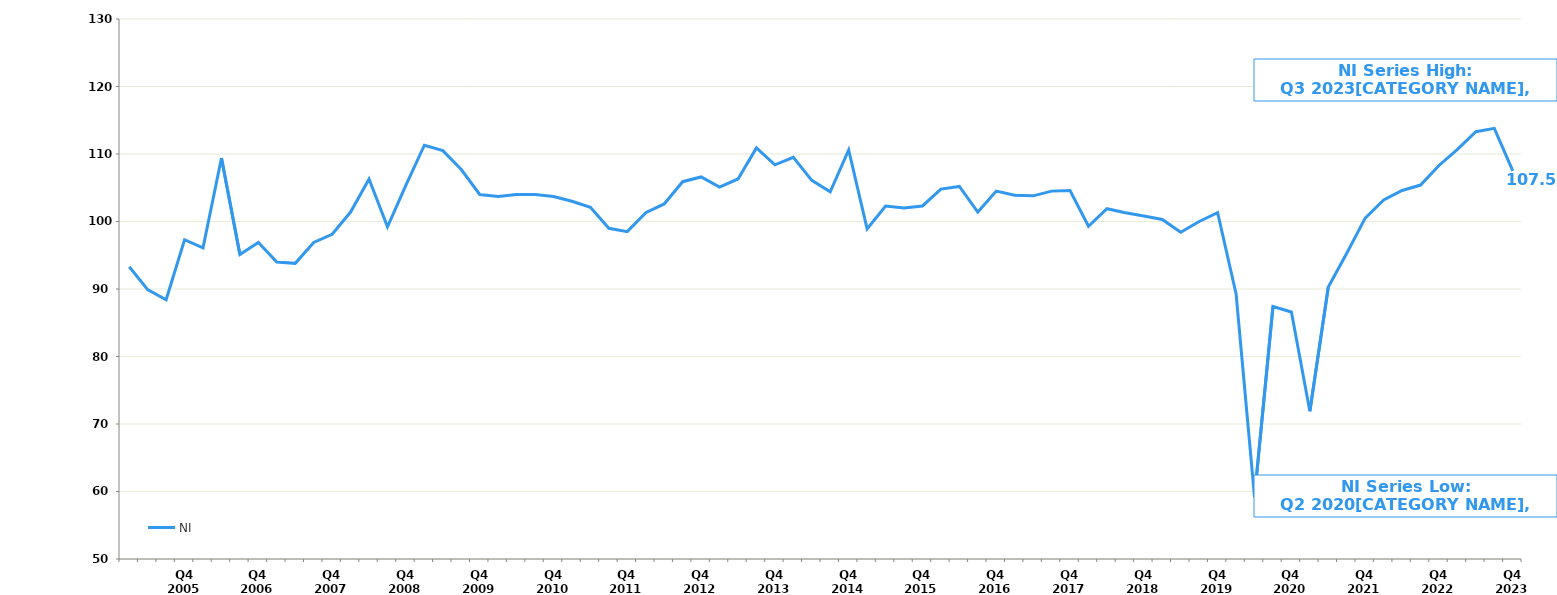
| Category | NI |
|---|---|
|  | 93.3 |
|  | 89.9 |
|  | 88.4 |
| Q4 2005 | 97.3 |
|  | 96.1 |
|  | 109.4 |
|  | 95.1 |
| Q4 2006 | 96.9 |
|  | 94 |
|  | 93.8 |
|  | 96.9 |
| Q4 2007 | 98.1 |
|  | 101.4 |
|  | 106.3 |
|  | 99.2 |
| Q4 2008 | 105.4 |
|  | 111.3 |
|  | 110.5 |
|  | 107.7 |
| Q4 2009 | 104 |
|  | 103.7 |
|  | 104 |
|  | 104 |
| Q4 2010 | 103.7 |
|  | 103 |
|  | 102.1 |
|  | 99 |
| Q4 2011 | 98.5 |
|  | 101.3 |
|  | 102.6 |
|  | 105.9 |
| Q4 2012 | 106.6 |
|  | 105.1 |
|  | 106.3 |
|  | 110.9 |
| Q4 2013 | 108.4 |
|  | 109.5 |
|  | 106.1 |
|  | 104.4 |
| Q4 2014 | 110.6 |
|  | 98.9 |
|  | 102.3 |
|  | 102 |
| Q4 2015 | 102.3 |
|  | 104.8 |
|  | 105.2 |
|  | 101.4 |
| Q4 2016 | 104.5 |
|  | 103.9 |
|  | 103.8 |
|  | 104.5 |
| Q4 2017 | 104.6 |
|  | 99.3 |
|  | 101.9 |
|  | 101.3 |
| Q4 2018 | 100.8 |
|  | 100.3 |
|  | 98.4 |
|  | 100 |
| Q4 2019 | 101.3 |
|  | 89.3 |
|  | 59.2 |
|  | 87.4 |
| Q4 2020 | 86.6 |
|  | 71.9 |
|  | 90.3 |
|  | 95.3 |
| Q4 2021 | 100.5 |
|  | 103.2 |
|  | 104.6 |
|  | 105.4 |
| Q4 2022 | 108.3 |
|  | 110.7 |
|  | 113.3 |
|  | 113.8 |
| Q4 2023 | 107.5 |